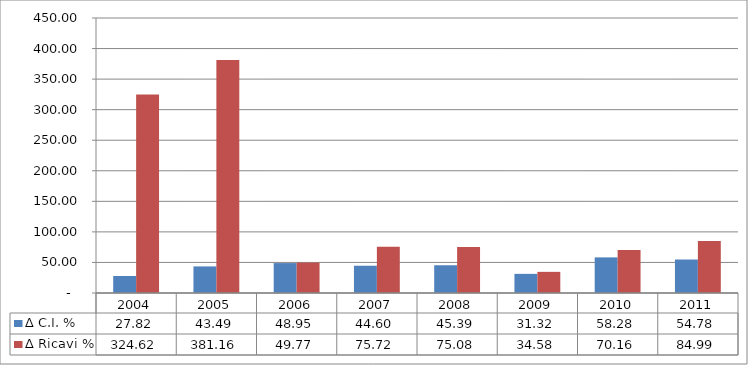
| Category | ∆ C.I. % | ∆ Ricavi % |
|---|---|---|
| 2004.0 | 27.818 | 324.615 |
| 2005.0 | 43.491 | 381.159 |
| 2006.0 | 48.948 | 49.774 |
| 2007.0 | 44.598 | 75.716 |
| 2008.0 | 45.394 | 75.079 |
| 2009.0 | 31.323 | 34.581 |
| 2010.0 | 58.277 | 70.164 |
| 2011.0 | 54.784 | 84.985 |